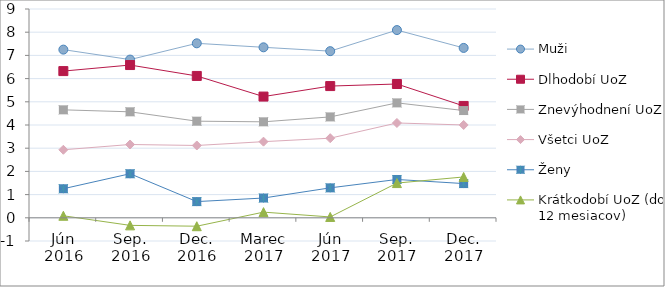
| Category | Muži | Dlhodobí UoZ | Znevýhodnení UoZ | Všetci UoZ | Ženy | Krátkodobí UoZ (do 12 mesiacov) |
|---|---|---|---|---|---|---|
| Jún 2016 | 7.249 | 6.324 | 4.653 | 2.932 | 1.252 | 0.088 |
| Sep. 2016 | 6.819 | 6.584 | 4.568 | 3.16 | 1.899 | -0.326 |
| Dec. 2016 | 7.521 | 6.115 | 4.165 | 3.117 | 0.698 | -0.363 |
| Marec 2017 | 7.349 | 5.225 | 4.137 | 3.281 | 0.852 | 0.245 |
| Jún 2017 | 7.183 | 5.678 | 4.349 | 3.431 | 1.291 | 0.037 |
| Sep. 2017 | 8.092 | 5.767 | 4.953 | 4.087 | 1.652 | 1.497 |
| Dec. 2017 | 7.322 | 4.822 | 4.623 | 4.001 | 1.475 | 1.76 |